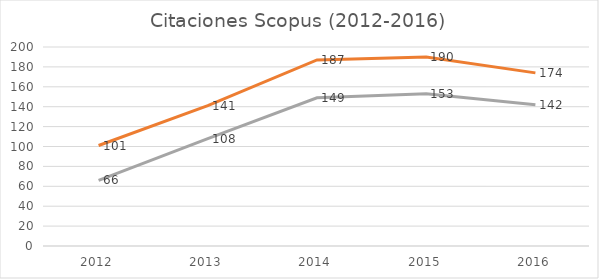
| Category | SCOPUS | ISI |
|---|---|---|
| 2012.0 | 101 | 66 |
| 2013.0 | 141 | 108 |
| 2014.0 | 187 | 149 |
| 2015.0 | 190 | 153 |
| 2016.0 | 174 | 142 |